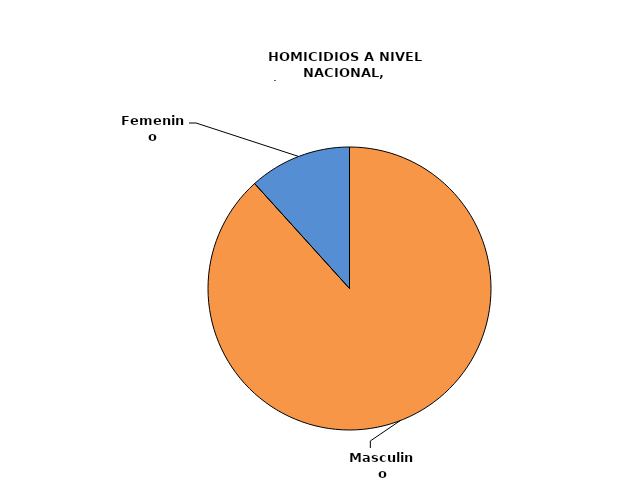
| Category | Masculino |
|---|---|
| Masculino | 1094 |
| Femenino | 145 |